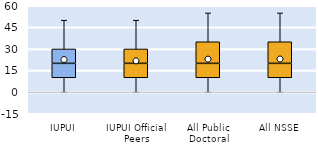
| Category | 25th | 50th | 75th |
|---|---|---|---|
| IUPUI | 10 | 10 | 10 |
| IUPUI Official Peers | 10 | 10 | 10 |
| All Public Doctoral | 10 | 10 | 15 |
| All NSSE | 10 | 10 | 15 |